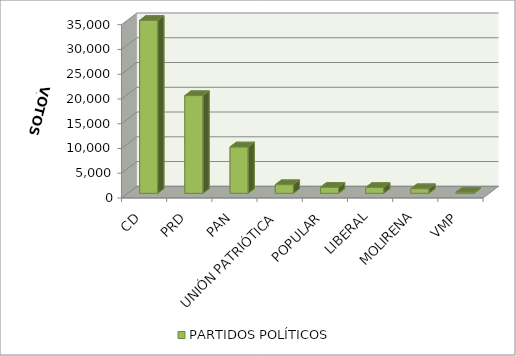
| Category | PARTIDOS POLÍTICOS |
|---|---|
| CD | 34942 |
| PRD | 19746 |
| PAN | 9378 |
| UNIÓN PATRIÓTICA | 1759 |
| POPULAR | 1243 |
| LIBERAL | 1187 |
| MOLIRENA | 949 |
| VMP | 247 |